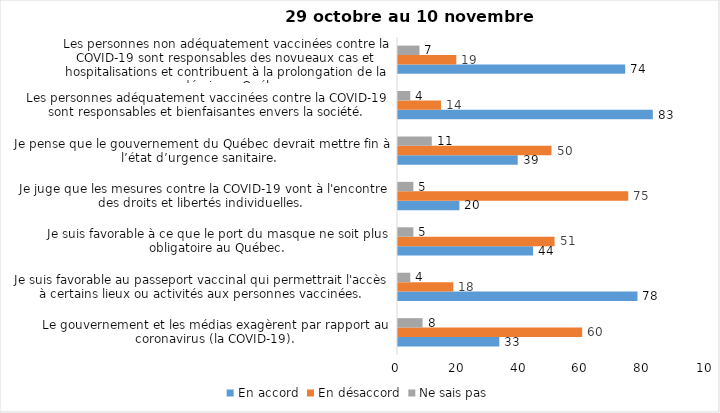
| Category | En accord | En désaccord | Ne sais pas |
|---|---|---|---|
| Le gouvernement et les médias exagèrent par rapport au coronavirus (la COVID-19). | 33 | 60 | 8 |
| Je suis favorable au passeport vaccinal qui permettrait l'accès à certains lieux ou activités aux personnes vaccinées. | 78 | 18 | 4 |
| Je suis favorable à ce que le port du masque ne soit plus obligatoire au Québec. | 44 | 51 | 5 |
| Je juge que les mesures contre la COVID-19 vont à l'encontre des droits et libertés individuelles.  | 20 | 75 | 5 |
| Je pense que le gouvernement du Québec devrait mettre fin à l’état d’urgence sanitaire.  | 39 | 50 | 11 |
| Les personnes adéquatement vaccinées contre la COVID-19 sont responsables et bienfaisantes envers la société. | 83 | 14 | 4 |
| Les personnes non adéquatement vaccinées contre la COVID-19 sont responsables des novueaux cas et hospitalisations et contribuent à la prolongation de la pandémie au Québec. | 74 | 19 | 7 |